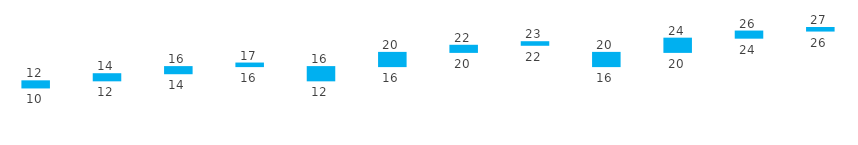
| Category | Series 0 | Series 1 | Series 2 |
|---|---|---|---|
| <2 | 10 | 2 | 12 |
| 2>&<4 | 12 | 2 | 14 |
| 4>&<10 | 14 | 2 | 16 |
| >10 | 16 | 1 | 17 |
| <2 | 12 | 4 | 16 |
| 2>&<4 | 16 | 4 | 20 |
| 4>&<10 | 20 | 2 | 22 |
| >10 | 22 | 1 | 23 |
| <2 | 16 | 4 | 20 |
| 2>&<4 | 20 | 4 | 24 |
| 4>&<10 | 24 | 2 | 26 |
| >10 | 26 | 1 | 27 |